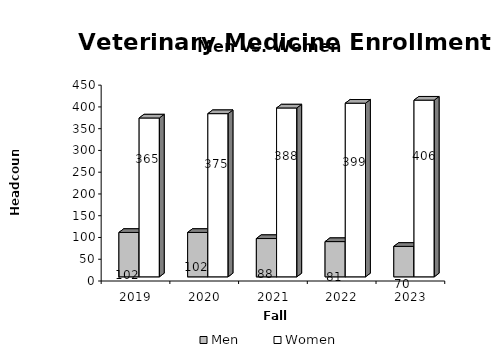
| Category | Men | Women |
|---|---|---|
| 2019.0 | 102 | 365 |
| 2020.0 | 102 | 375 |
| 2021.0 | 88 | 388 |
| 2022.0 | 81 | 399 |
| 2023.0 | 70 | 406 |